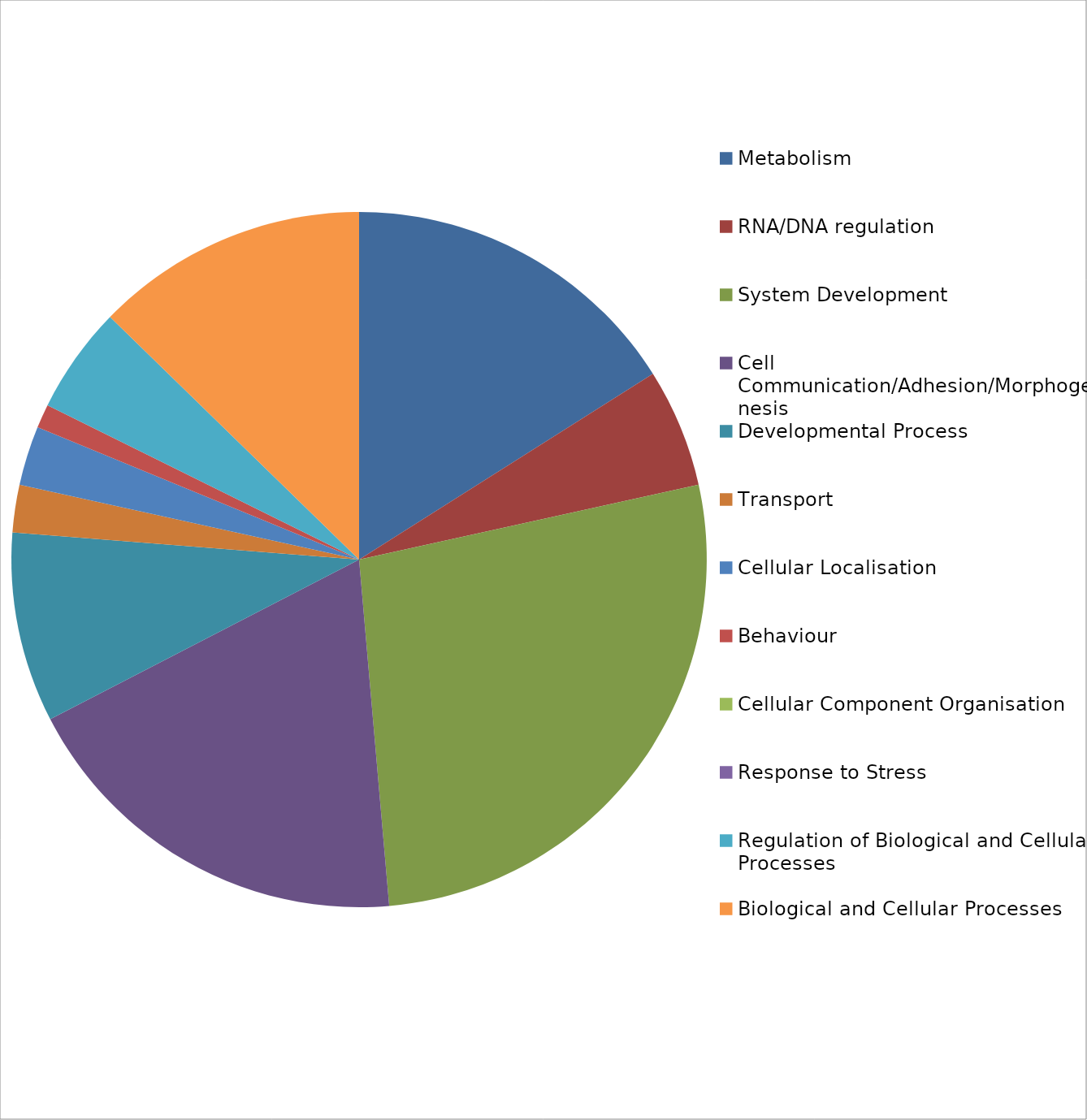
| Category | Series 0 | Series 1 |
|---|---|---|
| Metabolism | 29 | 16.022 |
| RNA/DNA regulation | 10 | 5.525 |
| System Development | 49 | 27.072 |
| Cell Communication/Adhesion/Morphogenesis | 34 | 18.785 |
| Developmental Process | 16 | 8.84 |
| Transport | 4 | 2.21 |
| Cellular Localisation | 5 | 2.762 |
| Behaviour | 2 | 1.105 |
| Cellular Component Organisation | 0 | 0 |
| Response to Stress | 0 | 0 |
| Regulation of Biological and Cellular Processes | 9 | 4.972 |
| Biological and Cellular Processes | 23 | 12.707 |